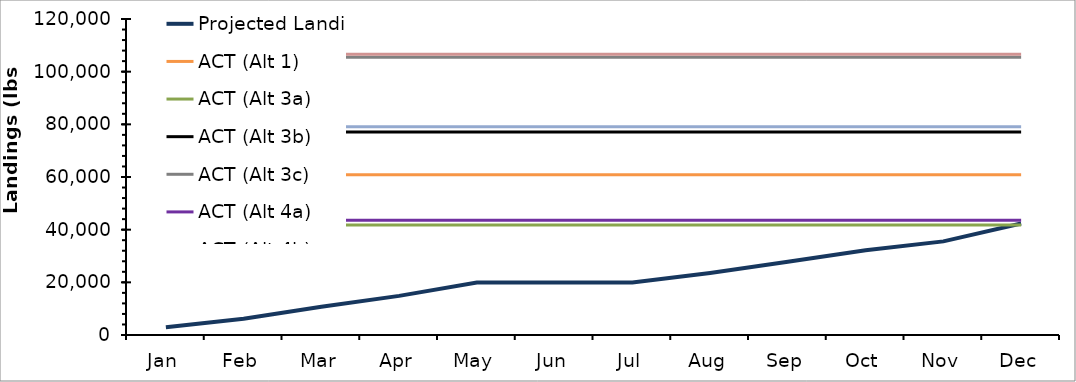
| Category | Projected Landings | ACT (Alt 1) | ACT (Alt 3a) | ACT (Alt 3b) | ACT (Alt 3c) | ACT (Alt 4a) | ACT (Alt 4b) | ACT (Alt 4c) |
|---|---|---|---|---|---|---|---|---|
| Jan | 2962.5 | 60900 | 41731 | 77087 | 105487 | 43534 | 79083 | 106582 |
| Feb | 6139.5 | 60900 | 41731 | 77087 | 105487 | 43534 | 79083 | 106582 |
| Mar | 10749.5 | 60900 | 41731 | 77087 | 105487 | 43534 | 79083 | 106582 |
| Apr | 14854 | 60900 | 41731 | 77087 | 105487 | 43534 | 79083 | 106582 |
| May | 19915 | 60900 | 41731 | 77087 | 105487 | 43534 | 79083 | 106582 |
| Jun | 19915 | 60900 | 41731 | 77087 | 105487 | 43534 | 79083 | 106582 |
| Jul | 19915 | 60900 | 41731 | 77087 | 105487 | 43534 | 79083 | 106582 |
| Aug | 23575 | 60900 | 41731 | 77087 | 105487 | 43534 | 79083 | 106582 |
| Sep | 27836.667 | 60900 | 41731 | 77087 | 105487 | 43534 | 79083 | 106582 |
| Oct | 32168.333 | 60900 | 41731 | 77087 | 105487 | 43534 | 79083 | 106582 |
| Nov | 35557.333 | 60900 | 41731 | 77087 | 105487 | 43534 | 79083 | 106582 |
| Dec | 42316 | 60900 | 41731 | 77087 | 105487 | 43534 | 79083 | 106582 |